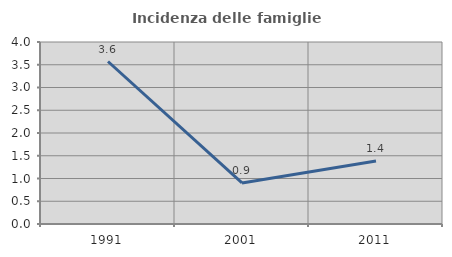
| Category | Incidenza delle famiglie numerose |
|---|---|
| 1991.0 | 3.571 |
| 2001.0 | 0.902 |
| 2011.0 | 1.384 |